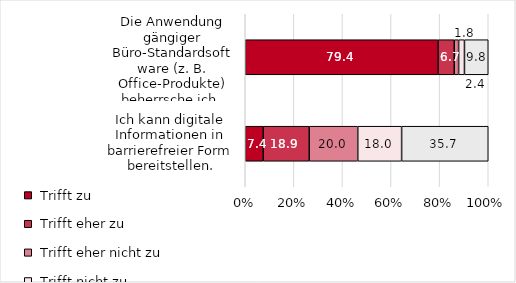
| Category | Series 0 | Series 1 | Series 2 | Series 3 | Series 4 |
|---|---|---|---|---|---|
| Die Anwendung gängiger Büro-Standardsoftware (z. B. Office-Produkte) beherrsche ich. | 79.4 | 6.7 | 1.8 | 2.4 | 9.8 |
| Ich kann digitale Informationen in barrierefreier Form bereitstellen. | 7.391 | 18.913 | 20 | 18.043 | 35.652 |